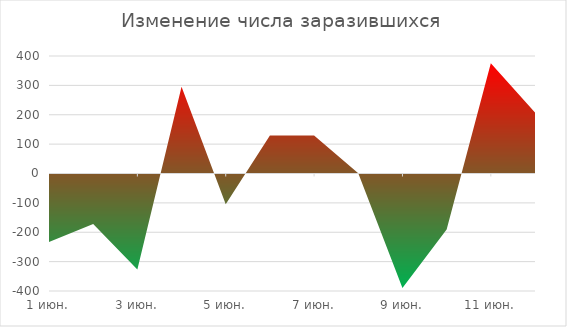
| Category | Series 0 |
|---|---|
| 2020-06-01 | -233 |
| 2020-06-02 | -172 |
| 2020-06-03 | -327 |
| 2020-06-04 | 295 |
| 2020-06-05 | -105 |
| 2020-06-06 | 129 |
| 2020-06-07 | 129 |
| 2020-06-08 | 1 |
| 2020-06-09 | -390 |
| 2020-06-10 | -191 |
| 2020-06-11 | 375 |
| 2020-06-12 | 208 |